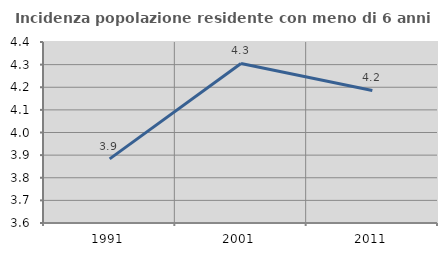
| Category | Incidenza popolazione residente con meno di 6 anni |
|---|---|
| 1991.0 | 3.883 |
| 2001.0 | 4.305 |
| 2011.0 | 4.186 |